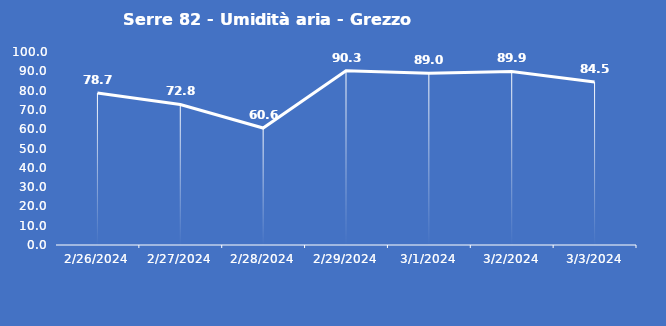
| Category | Serre 82 - Umidità aria - Grezzo (%) |
|---|---|
| 2/26/24 | 78.7 |
| 2/27/24 | 72.8 |
| 2/28/24 | 60.6 |
| 2/29/24 | 90.3 |
| 3/1/24 | 89 |
| 3/2/24 | 89.9 |
| 3/3/24 | 84.5 |